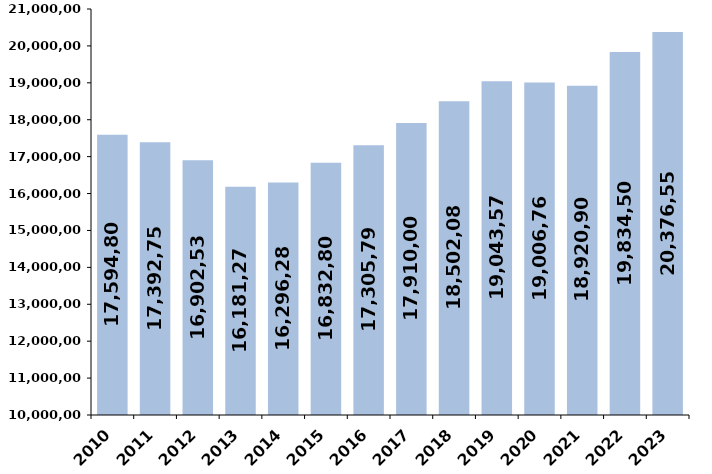
| Category | % de variación
 interanual |
|---|---|
| 2010 | 17594808.39 |
| 2011 | 17392754.21 |
| 2012 | 16902530.42 |
| 2013 | 16181274.84 |
| 2014 | 16296288.23 |
| 2015 | 16832800.5 |
| 2016 | 17305798.02 |
| 2017 | 17910006.63 |
| 2018 | 18502087.6 |
| 2019 | 19043576.33 |
| 2020 | 19006759.591 |
| 2021 | 18920902 |
| 2022 | 19834504 |
| 2023 | 20376552.304 |